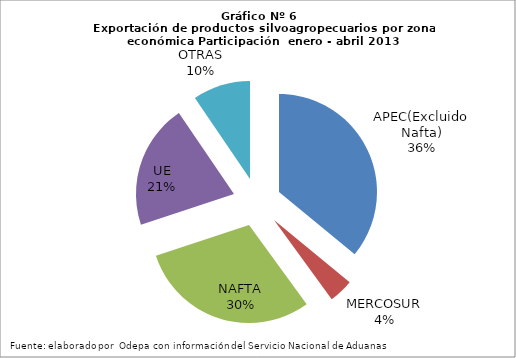
| Category | Series 0 |
|---|---|
| APEC(Excluido Nafta) | 1991694.617 |
| MERCOSUR | 222624.558 |
| NAFTA | 1658916.47 |
| UE | 1138224.911 |
| OTRAS | 526443.444 |